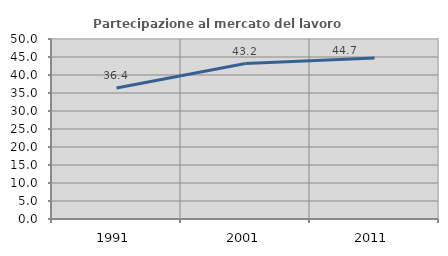
| Category | Partecipazione al mercato del lavoro  femminile |
|---|---|
| 1991.0 | 36.415 |
| 2001.0 | 43.194 |
| 2011.0 | 44.737 |